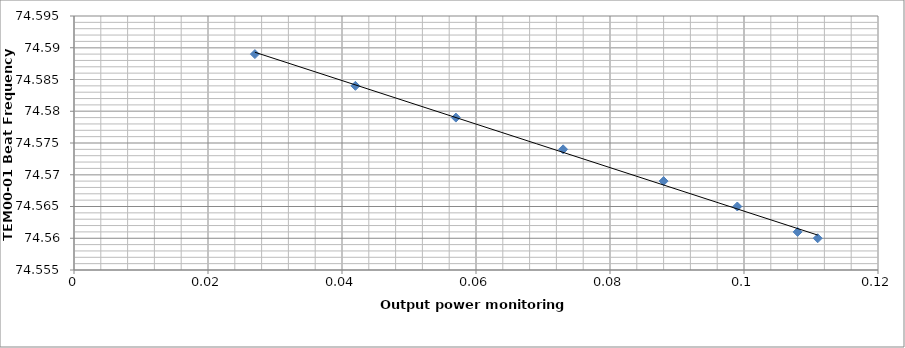
| Category | Series 0 |
|---|---|
| 0.111 | 74.56 |
| 0.108 | 74.561 |
| 0.099 | 74.565 |
| 0.088 | 74.569 |
| 0.073 | 74.574 |
| 0.057 | 74.579 |
| 0.042 | 74.584 |
| 0.027 | 74.589 |